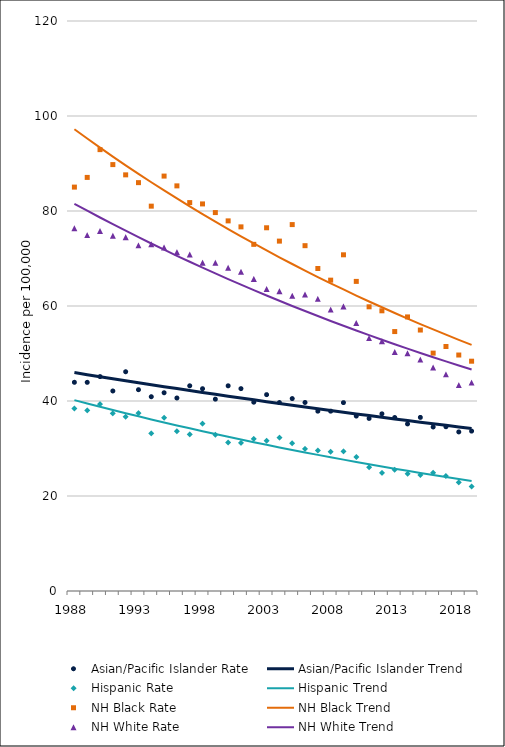
| Category | Asian/Pacific Islander Rate | Asian/Pacific Islander Trend | Hispanic Rate | Hispanic Trend | NH Black Rate | NH Black Trend | NH White Rate | NH White Trend |
|---|---|---|---|---|---|---|---|---|
| 1988.0 | 43.94 | 45.98 | 38.42 | 40.19 | 85.03 | 97.2 | 76.37 | 81.51 |
| 1989.0 | 43.93 | 45.54 | 38.02 | 39.49 | 87.07 | 95.25 | 74.93 | 80.06 |
| 1990.0 | 45.14 | 45.11 | 39.36 | 38.79 | 92.92 | 93.33 | 75.79 | 78.63 |
| 1991.0 | 42.11 | 44.68 | 37.4 | 38.1 | 89.77 | 91.46 | 74.79 | 77.23 |
| 1992.0 | 46.16 | 44.26 | 36.7 | 37.43 | 87.61 | 89.62 | 74.49 | 75.85 |
| 1993.0 | 42.38 | 43.84 | 37.45 | 36.77 | 85.97 | 87.82 | 72.77 | 74.49 |
| 1994.0 | 40.9 | 43.42 | 33.2 | 36.12 | 81.02 | 86.06 | 73 | 73.16 |
| 1995.0 | 41.74 | 43.01 | 36.48 | 35.49 | 87.35 | 84.33 | 72.33 | 71.86 |
| 1996.0 | 40.63 | 42.61 | 33.65 | 34.86 | 85.29 | 82.64 | 71.34 | 70.57 |
| 1997.0 | 43.2 | 42.2 | 32.98 | 34.25 | 81.77 | 80.98 | 70.85 | 69.31 |
| 1998.0 | 42.59 | 41.8 | 35.24 | 33.64 | 81.49 | 79.35 | 69.12 | 68.08 |
| 1999.0 | 40.39 | 41.4 | 32.89 | 33.05 | 79.67 | 77.76 | 69.11 | 66.86 |
| 2000.0 | 43.2 | 41.01 | 31.28 | 32.47 | 77.92 | 76.19 | 68.04 | 65.67 |
| 2001.0 | 42.6 | 40.62 | 31.17 | 31.89 | 76.66 | 74.66 | 67.22 | 64.49 |
| 2002.0 | 39.75 | 40.24 | 32.04 | 31.33 | 72.98 | 73.16 | 65.71 | 63.34 |
| 2003.0 | 41.34 | 39.86 | 31.63 | 30.78 | 76.47 | 71.69 | 63.57 | 62.21 |
| 2004.0 | 39.67 | 39.48 | 32.29 | 30.23 | 73.66 | 70.25 | 63.13 | 61.1 |
| 2005.0 | 40.51 | 39.1 | 31.11 | 29.7 | 77.14 | 68.84 | 62.17 | 60.01 |
| 2006.0 | 39.69 | 38.73 | 29.93 | 29.18 | 72.7 | 67.46 | 62.43 | 58.94 |
| 2007.0 | 37.86 | 38.37 | 29.58 | 28.66 | 67.9 | 66.1 | 61.51 | 57.89 |
| 2008.0 | 37.86 | 38 | 29.31 | 28.16 | 65.44 | 64.78 | 59.25 | 56.85 |
| 2009.0 | 39.66 | 37.64 | 29.41 | 27.66 | 70.78 | 63.48 | 59.92 | 55.84 |
| 2010.0 | 36.83 | 37.28 | 28.21 | 27.17 | 65.18 | 62.2 | 56.42 | 54.84 |
| 2011.0 | 36.33 | 36.93 | 26.05 | 26.69 | 59.83 | 60.95 | 53.24 | 53.86 |
| 2012.0 | 37.3 | 36.58 | 24.87 | 26.22 | 58.99 | 59.73 | 52.6 | 52.9 |
| 2013.0 | 36.52 | 36.23 | 25.53 | 25.76 | 54.62 | 58.53 | 50.32 | 51.96 |
| 2014.0 | 35.17 | 35.89 | 24.69 | 25.31 | 57.7 | 57.35 | 50.04 | 51.03 |
| 2015.0 | 36.55 | 35.55 | 24.44 | 24.86 | 54.94 | 56.2 | 48.72 | 50.12 |
| 2016.0 | 34.53 | 35.21 | 24.88 | 24.42 | 50.08 | 55.07 | 47.04 | 49.22 |
| 2017.0 | 34.58 | 34.88 | 24.21 | 23.99 | 51.47 | 53.97 | 45.61 | 48.34 |
| 2018.0 | 33.49 | 34.55 | 22.85 | 23.57 | 49.68 | 52.88 | 43.35 | 47.48 |
| 2019.0 | 33.66 | 34.22 | 22 | 23.15 | 48.38 | 51.82 | 43.88 | 46.63 |